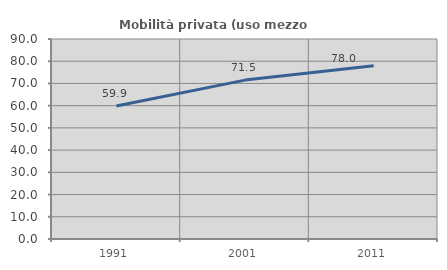
| Category | Mobilità privata (uso mezzo privato) |
|---|---|
| 1991.0 | 59.857 |
| 2001.0 | 71.5 |
| 2011.0 | 77.976 |